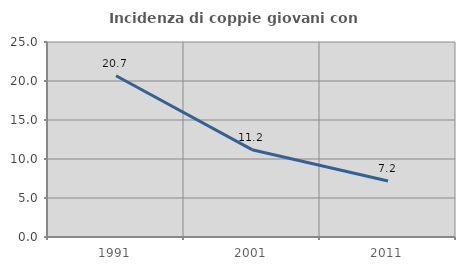
| Category | Incidenza di coppie giovani con figli |
|---|---|
| 1991.0 | 20.678 |
| 2001.0 | 11.195 |
| 2011.0 | 7.183 |